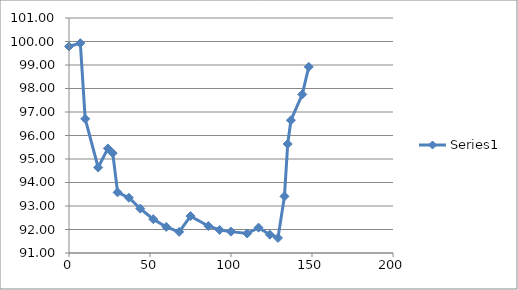
| Category | Series 0 |
|---|---|
| 0.0 | 99.79 |
| 7.0 | 99.93 |
| 10.0 | 96.71 |
| 18.0 | 94.64 |
| 24.0 | 95.45 |
| 27.0 | 95.25 |
| 30.0 | 93.58 |
| 37.0 | 93.35 |
| 44.0 | 92.89 |
| 52.0 | 92.44 |
| 60.0 | 92.11 |
| 68.0 | 91.9 |
| 75.0 | 92.57 |
| 86.0 | 92.15 |
| 93.0 | 91.98 |
| 100.0 | 91.91 |
| 110.0 | 91.83 |
| 117.0 | 92.08 |
| 124.0 | 91.78 |
| 129.0 | 91.64 |
| 133.0 | 93.41 |
| 135.0 | 95.64 |
| 137.0 | 96.65 |
| 144.0 | 97.75 |
| 148.0 | 98.92 |